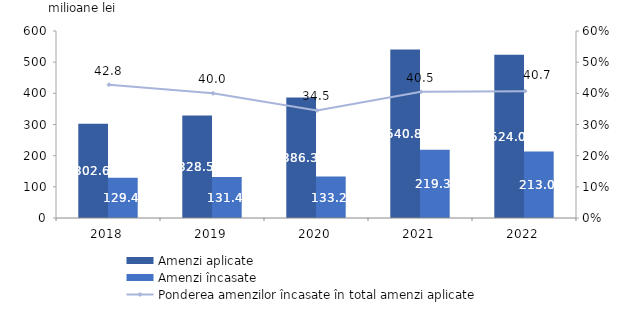
| Category | Amenzi aplicate | Amenzi încasate |
|---|---|---|
| 2018.0 | 302.6 | 129.4 |
| 2019.0 | 328.5 | 131.4 |
| 2020.0 | 386.3 | 133.2 |
| 2021.0 | 540.8 | 219.3 |
| 2022.0 | 524 | 213 |